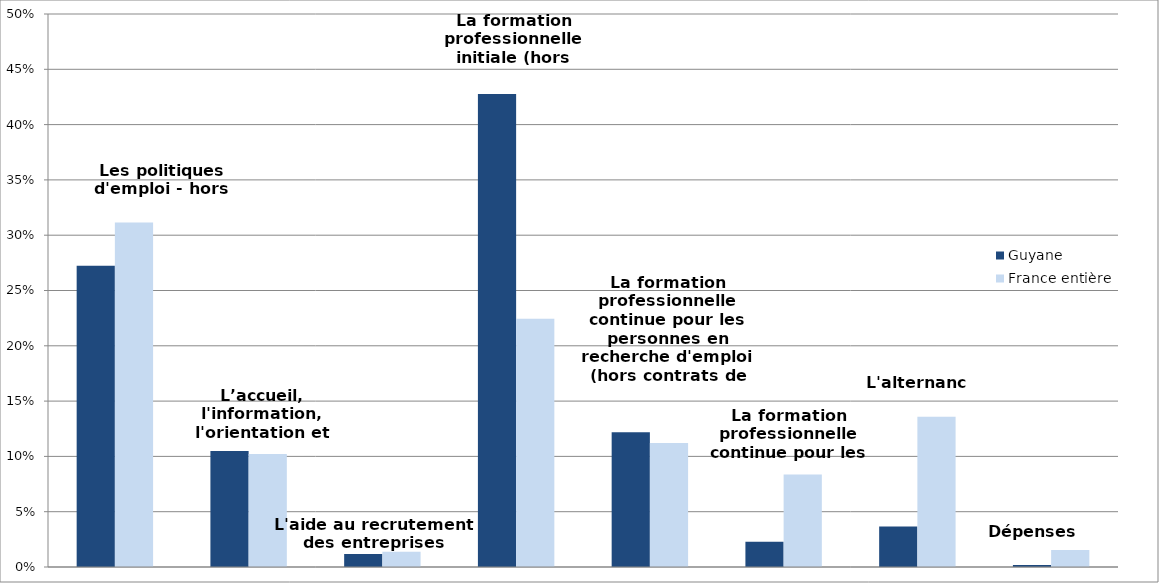
| Category | Guyane | France entière |
|---|---|---|
| Les politiques d'emploi - hors mesures zonées | 0.272 | 0.311 |
| L’accueil, l'information, l'orientation et l'accompagnement | 0.105 | 0.102 |
| L'aide au recrutement des entreprises | 0.012 | 0.014 |
| La formation professionnelle initiale (hors apprentissage) | 0.428 | 0.225 |
| La formation professionnelle continue pour les personnes en recherche d'emploi (hors contrats de professionnalisation) | 0.122 | 0.112 |
| La formation professionnelle continue pour les actifs occupés | 0.023 | 0.084 |
| L'alternance | 0.037 | 0.136 |
| Dépenses non-ventilables | 0.002 | 0.015 |